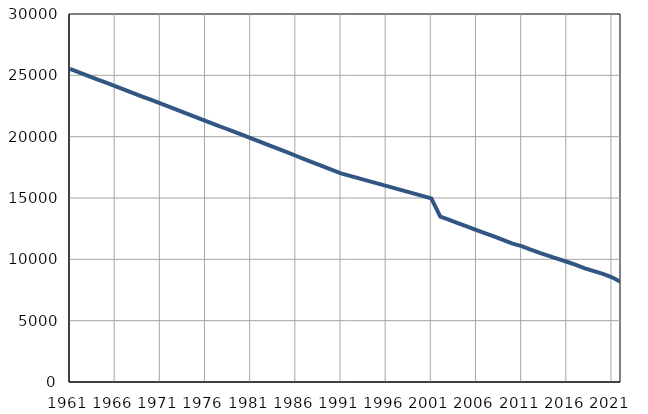
| Category | Population
size |
|---|---|
| 1961.0 | 25520 |
| 1962.0 | 25239 |
| 1963.0 | 24958 |
| 1964.0 | 24677 |
| 1965.0 | 24396 |
| 1966.0 | 24114 |
| 1967.0 | 23834 |
| 1968.0 | 23553 |
| 1969.0 | 23272 |
| 1970.0 | 22991 |
| 1971.0 | 22710 |
| 1972.0 | 22427 |
| 1973.0 | 22143 |
| 1974.0 | 21860 |
| 1975.0 | 21577 |
| 1976.0 | 21294 |
| 1977.0 | 21010 |
| 1978.0 | 20727 |
| 1979.0 | 20444 |
| 1980.0 | 20160 |
| 1981.0 | 19877 |
| 1982.0 | 19590 |
| 1983.0 | 19304 |
| 1984.0 | 19017 |
| 1985.0 | 18731 |
| 1986.0 | 18444 |
| 1987.0 | 18156 |
| 1988.0 | 17871 |
| 1989.0 | 17584 |
| 1990.0 | 17299 |
| 1991.0 | 17011 |
| 1992.0 | 16807 |
| 1993.0 | 16602 |
| 1994.0 | 16398 |
| 1995.0 | 16194 |
| 1996.0 | 15991 |
| 1997.0 | 15785 |
| 1998.0 | 15581 |
| 1999.0 | 15377 |
| 2000.0 | 15173 |
| 2001.0 | 14968 |
| 2002.0 | 13489 |
| 2003.0 | 13213 |
| 2004.0 | 12941 |
| 2005.0 | 12662 |
| 2006.0 | 12388 |
| 2007.0 | 12122 |
| 2008.0 | 11845 |
| 2009.0 | 11567 |
| 2010.0 | 11275 |
| 2011.0 | 11081 |
| 2012.0 | 10792 |
| 2013.0 | 10525 |
| 2014.0 | 10285 |
| 2015.0 | 10035 |
| 2016.0 | 9802 |
| 2017.0 | 9552 |
| 2018.0 | 9270 |
| 2019.0 | 9037 |
| 2020.0 | 8811 |
| 2021.0 | 8537 |
| 2022.0 | 8161 |